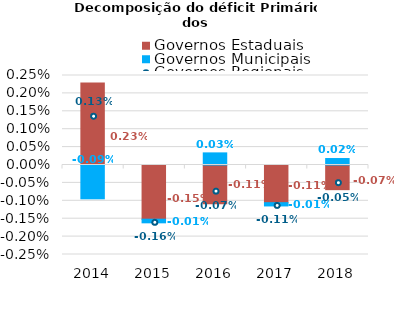
| Category | Governos Estaduais  | Governos Municipais |
|---|---|---|
| 2014.0 | 0.002 | -0.001 |
| 2015.0 | -0.002 | 0 |
| 2016.0 | -0.001 | 0 |
| 2017.0 | -0.001 | 0 |
| 2018.0 | -0.001 | 0 |